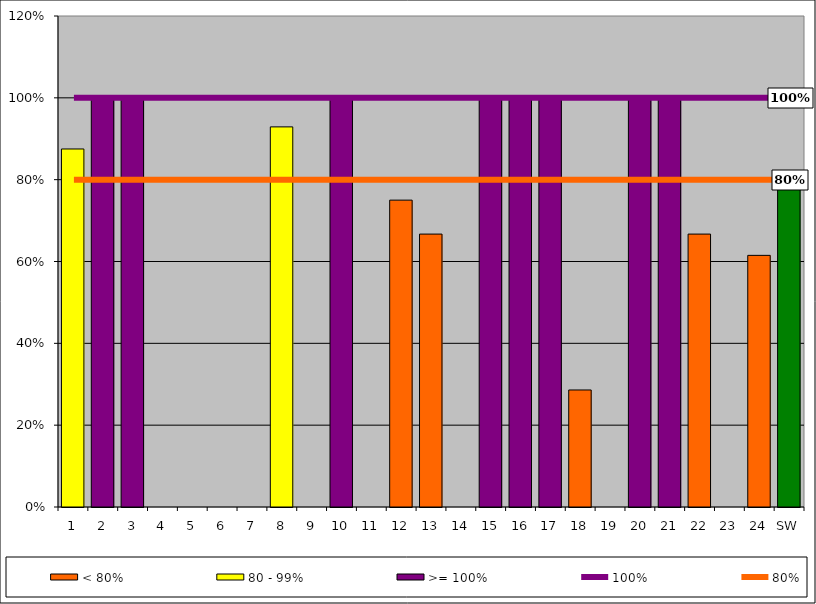
| Category | < 80% | 80 - 99% | >= 100% |
|---|---|---|---|
| 1 | 0 | 0.875 | 0 |
| 2 | 0 | 0 | 1 |
| 3 | 0 | 0 | 1 |
| 4 | 0 | 0 | 0 |
| 5 | 0 | 0 | 0 |
| 6 | 0 | 0 | 0 |
| 7 | 0 | 0 | 0 |
| 8 | 0 | 0.929 | 0 |
| 9 | 0 | 0 | 0 |
| 10 | 0 | 0 | 1 |
| 11 | 0 | 0 | 0 |
| 12 | 0.75 | 0 | 0 |
| 13 | 0.667 | 0 | 0 |
| 14 | 0 | 0 | 0 |
| 15 | 0 | 0 | 1 |
| 16 | 0 | 0 | 1 |
| 17 | 0 | 0 | 1 |
| 18 | 0.286 | 0 | 0 |
| 19 | 0 | 0 | 0 |
| 20 | 0 | 0 | 1 |
| 21 | 0 | 0 | 1 |
| 22 | 0.667 | 0 | 0 |
| 23 | 0 | 0 | 0 |
| 24 | 0.615 | 0 | 0 |
| SW | 0.776 | 0 | 0 |